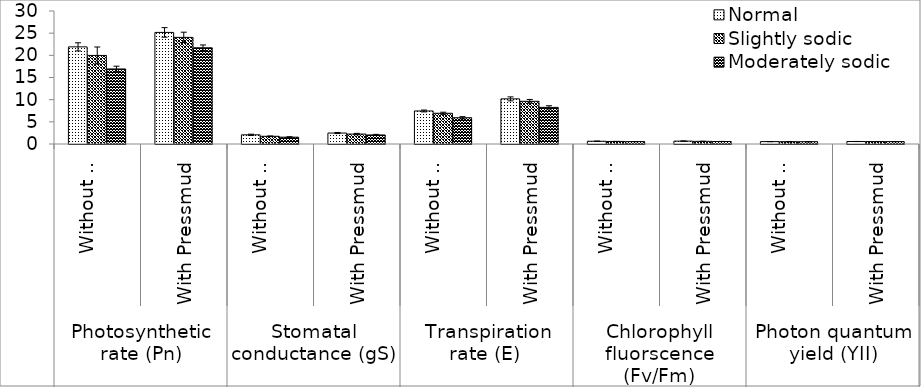
| Category | Normal | Slightly sodic | Moderately sodic |
|---|---|---|---|
| 0 | 21.91 | 19.98 | 16.93 |
| 1 | 25.17 | 24.05 | 21.7 |
| 2 | 2.07 | 1.74 | 1.54 |
| 3 | 2.47 | 2.24 | 2.04 |
| 4 | 7.45 | 6.93 | 5.92 |
| 5 | 10.18 | 9.63 | 8.26 |
| 6 | 0.619 | 0.575 | 0.542 |
| 7 | 0.648 | 0.598 | 0.563 |
| 8 | 0.541 | 0.528 | 0.515 |
| 9 | 0.562 | 0.551 | 0.538 |